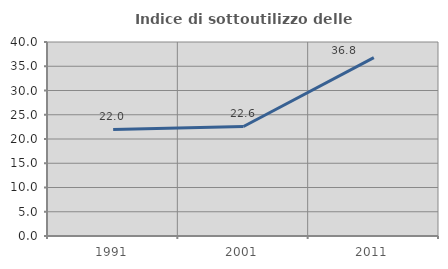
| Category | Indice di sottoutilizzo delle abitazioni  |
|---|---|
| 1991.0 | 21.965 |
| 2001.0 | 22.581 |
| 2011.0 | 36.788 |